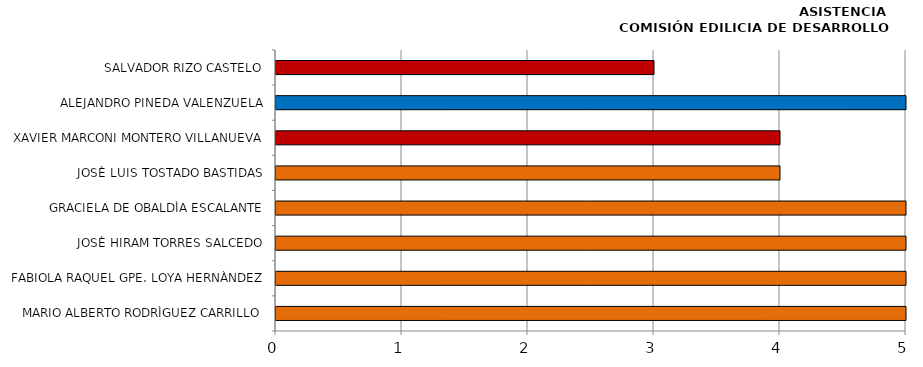
| Category | Series 0 |
|---|---|
| MARIO ALBERTO RODRÌGUEZ CARRILLO | 5 |
| FABIOLA RAQUEL GPE. LOYA HERNÀNDEZ | 5 |
| JOSÈ HIRAM TORRES SALCEDO | 5 |
| GRACIELA DE OBALDÌA ESCALANTE | 5 |
| JOSÈ LUIS TOSTADO BASTIDAS | 4 |
| XAVIER MARCONI MONTERO VILLANUEVA | 4 |
| ALEJANDRO PINEDA VALENZUELA | 5 |
| SALVADOR RIZO CASTELO | 3 |